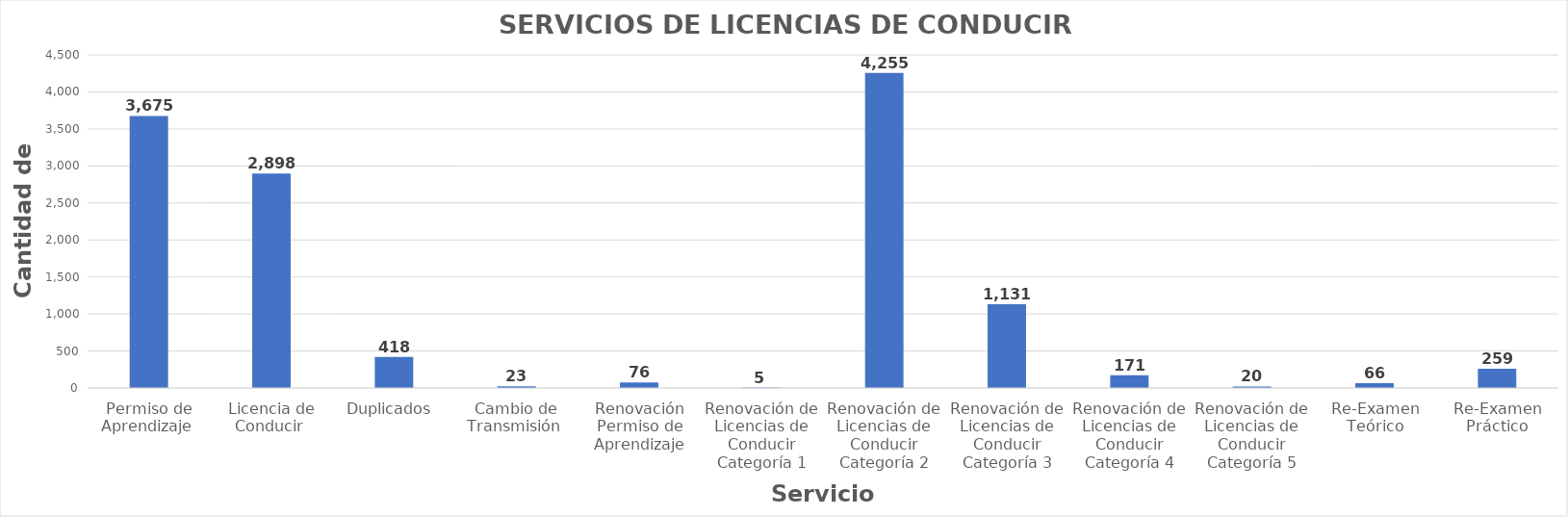
| Category | Series 0 |
|---|---|
| Permiso de Aprendizaje  | 3675 |
| Licencia de Conducir  | 2898 |
| Duplicados  | 418 |
| Cambio de Transmisión  | 23 |
| Renovación Permiso de Aprendizaje | 76 |
| Renovación de Licencias de Conducir Categoría 1 | 5 |
| Renovación de Licencias de Conducir Categoría 2 | 4255 |
| Renovación de Licencias de Conducir Categoría 3 | 1131 |
| Renovación de Licencias de Conducir Categoría 4 | 171 |
| Renovación de Licencias de Conducir Categoría 5 | 20 |
| Re-Examen Teórico | 66 |
| Re-Examen Práctico | 259 |